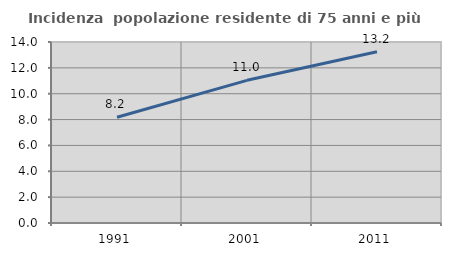
| Category | Incidenza  popolazione residente di 75 anni e più |
|---|---|
| 1991.0 | 8.183 |
| 2001.0 | 11.035 |
| 2011.0 | 13.248 |